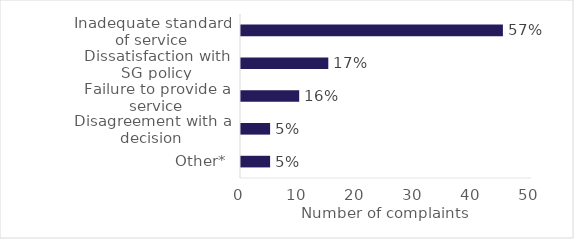
| Category | Series 0 |
|---|---|
| Other* | 5 |
| Disagreement with a decision | 5 |
| Failure to provide a service | 10 |
| Dissatisfaction with SG policy | 15 |
| Inadequate standard of service | 45 |